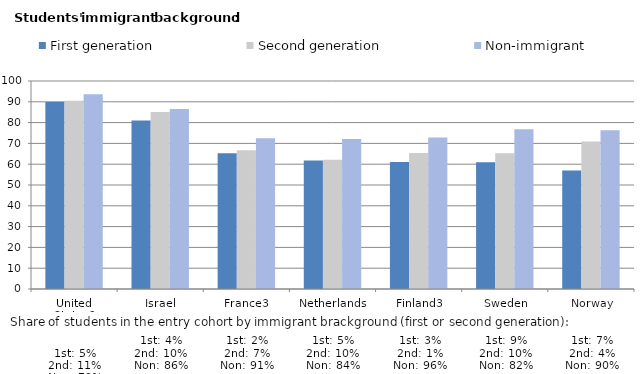
| Category | First generation | Second generation | Non-immigrant |
|---|---|---|---|
| United States2


1st: 5%
2nd: 11%
Non: 79% | 89.86 | 90.543 | 93.66 |
| Israel


1st: 4%
2nd: 10%
Non: 86% | 81.069 | 85.057 | 86.516 |
| France3


1st: 2%
2nd: 7%
Non: 91% | 65.239 | 66.701 | 72.424 |
| Netherlands


1st: 5%
2nd: 10%
Non: 84% | 61.768 | 62.168 | 72.117 |
| Finland3


1st: 3%
2nd: 1%
Non: 96% | 61.118 | 65.367 | 72.872 |
| Sweden


1st: 9%
2nd: 10%
Non: 82% | 60.925 | 65.234 | 76.828 |
| Norway


1st: 7%
2nd: 4%
Non: 90% | 56.99 | 70.929 | 76.35 |